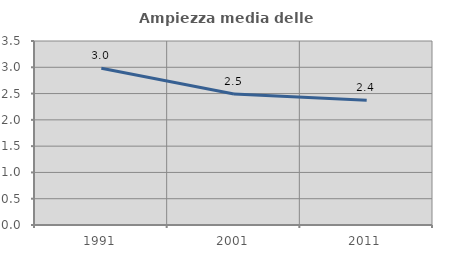
| Category | Ampiezza media delle famiglie |
|---|---|
| 1991.0 | 2.98 |
| 2001.0 | 2.491 |
| 2011.0 | 2.374 |